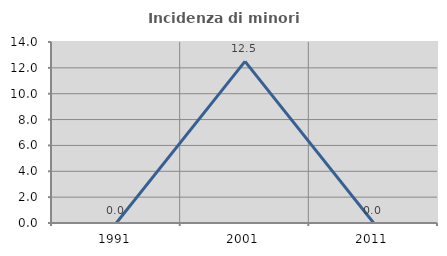
| Category | Incidenza di minori stranieri |
|---|---|
| 1991.0 | 0 |
| 2001.0 | 12.5 |
| 2011.0 | 0 |